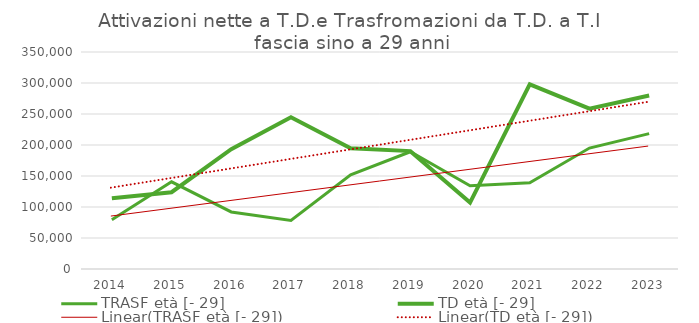
| Category | TRASF età [- 29] | TD età [- 29] |
|---|---|---|
| 2014.0 | 79565 | 114176 |
| 2015.0 | 140599 | 123863 |
| 2016.0 | 92032 | 193325 |
| 2017.0 | 78354 | 244869 |
| 2018.0 | 151956 | 194709 |
| 2019.0 | 189113 | 190132 |
| 2020.0 | 134317 | 107053 |
| 2021.0 | 138921 | 297854 |
| 2022.0 | 195069 | 258510 |
| 2023.0 | 218397 | 279882 |